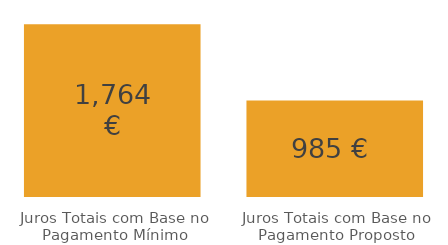
| Category | Series 0 |
|---|---|
| Juros Totais com Base no Pagamento Mínimo | 1763.952 |
| Juros Totais com Base no Pagamento Proposto | 984.811 |